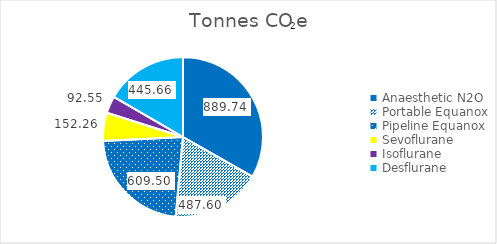
| Category | Tonnes CO2e |
|---|---|
| Anaesthetic N2O | 889.738 |
| Portable Equanox | 487.6 |
| Pipeline Equanox | 609.5 |
| Sevoflurane | 152.26 |
| Isoflurane | 92.554 |
| Desflurane | 445.66 |